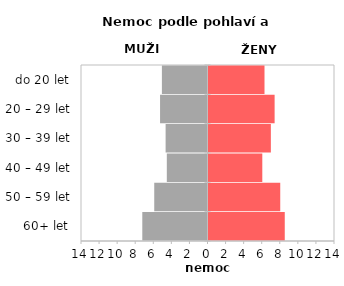
| Category | Nemoc |
|---|---|
| 60+ let | 8.44 |
| 50 – 59 let | 7.94 |
| 40 – 49 let | 5.954 |
| 30 – 39 let | 6.902 |
| 20 – 29 let | 7.318 |
| do 20 let | 6.198 |